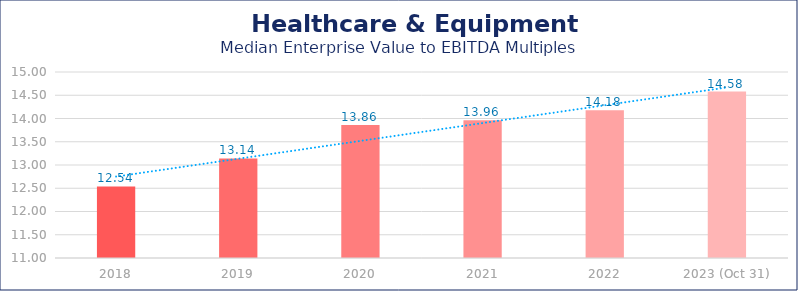
| Category | Healthcare & Equipment |
|---|---|
| 2018 | 12.54 |
| 2019 | 13.14 |
| 2020 | 13.86 |
| 2021 | 13.96 |
| 2022 | 14.18 |
| 2023 (Oct 31) | 14.58 |